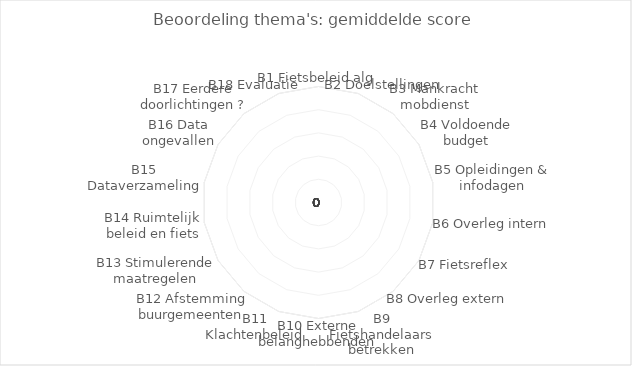
| Category | Niveau 1 | Niveau 2 |
|---|---|---|
| B1 Fietsbeleid alg | 0 | 0 |
| B2 Doelstellingen | 0 | 0 |
| B3 Mankracht mobdienst | 0 | 0 |
| B4 Voldoende budget | 0 | 0 |
| B5 Opleidingen & infodagen | 0 | 0 |
| B6 Overleg intern | 0 | 0 |
| B7 Fietsreflex | 0 | 0 |
| B8 Overleg extern | 0 | 0 |
| B9 Fietshandelaars betrekken | 0 | 0 |
| B10 Externe belanghebbenden | 0 | 0 |
| B11 Klachtenbeleid | 0 | 0 |
| B12 Afstemming buurgemeenten | 0 | 0 |
| B13 Stimulerende maatregelen | 0 | 0 |
| B14 Ruimtelijk beleid en fiets | 0 | 0 |
| B15 Dataverzameling | 0 | 0 |
| B16 Data ongevallen | 0 | 0 |
| B17 Eerdere doorlichtingen ? | 0 | 0 |
| B18 Evaluatie | 0 | 0 |